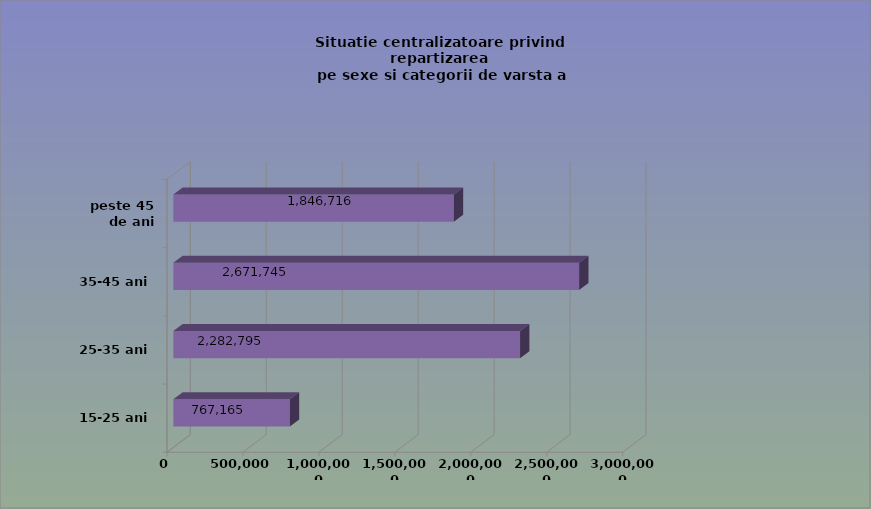
| Category | 15-25 ani 25-35 ani 35-45 ani peste 45 de ani |
|---|---|
| 15-25 ani | 767165 |
| 25-35 ani | 2282795 |
| 35-45 ani | 2671745 |
| peste 45 de ani | 1846716 |